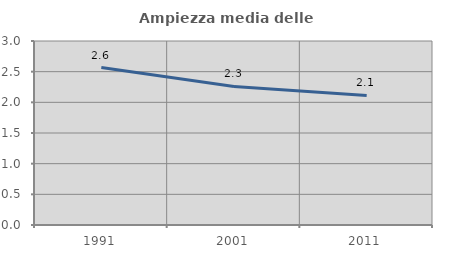
| Category | Ampiezza media delle famiglie |
|---|---|
| 1991.0 | 2.567 |
| 2001.0 | 2.259 |
| 2011.0 | 2.112 |